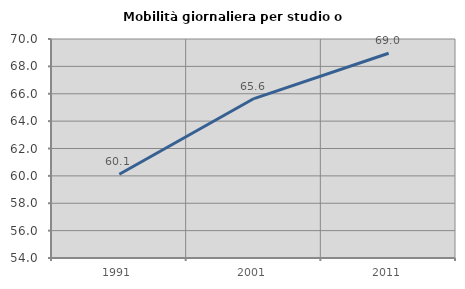
| Category | Mobilità giornaliera per studio o lavoro |
|---|---|
| 1991.0 | 60.122 |
| 2001.0 | 65.649 |
| 2011.0 | 68.96 |